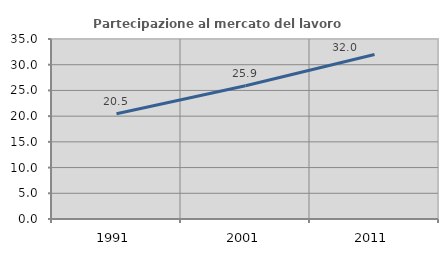
| Category | Partecipazione al mercato del lavoro  femminile |
|---|---|
| 1991.0 | 20.455 |
| 2001.0 | 25.896 |
| 2011.0 | 31.984 |